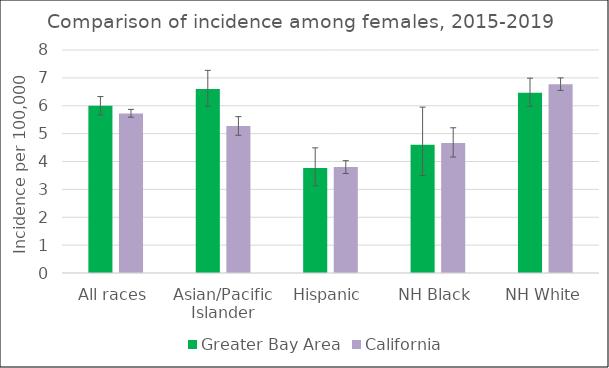
| Category | Greater Bay Area | California | SEER 18 |
|---|---|---|---|
| All races | 6 | 5.72 |  |
| Asian/Pacific Islander | 6.6 | 5.27 |  |
| Hispanic | 3.77 | 3.8 |  |
| NH Black | 4.6 | 4.66 |  |
| NH White | 6.47 | 6.77 |  |